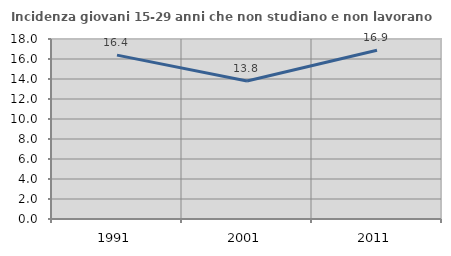
| Category | Incidenza giovani 15-29 anni che non studiano e non lavorano  |
|---|---|
| 1991.0 | 16.385 |
| 2001.0 | 13.793 |
| 2011.0 | 16.867 |